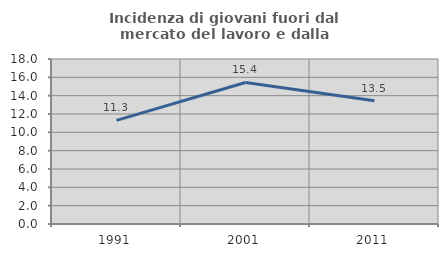
| Category | Incidenza di giovani fuori dal mercato del lavoro e dalla formazione  |
|---|---|
| 1991.0 | 11.302 |
| 2001.0 | 15.44 |
| 2011.0 | 13.456 |